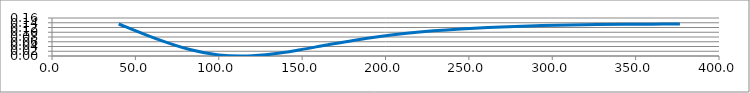
| Category | Series 0 |
|---|---|
| 40.0071 | 0.135 |
| 62.2559 | 0.073 |
| 81.9962 | 0.028 |
| 99.9882 | 0.005 |
| 116.861 | 0 |
| 133.094 | 0.009 |
| 149.021 | 0.027 |
| 164.855 | 0.046 |
| 180.714 | 0.066 |
| 196.656 | 0.082 |
| 212.699 | 0.096 |
| 228.841 | 0.106 |
| 245.07 | 0.114 |
| 261.369 | 0.12 |
| 277.724 | 0.125 |
| 294.122 | 0.128 |
| 310.556 | 0.131 |
| 327.019 | 0.132 |
| 343.509 | 0.133 |
| 360.025 | 0.134 |
| 376.569 | 0.135 |